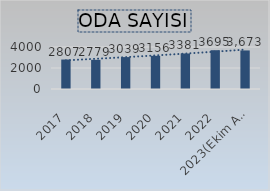
| Category | Series 6 |
|---|---|
| 2017 | 2807 |
| 2018 | 2779 |
| 2019 | 3039 |
| 2020 | 3156 |
| 2021 | 3381 |
| 2022 | 3695 |
| 2023(Ekim Ayı İtibariyle) | 3673 |